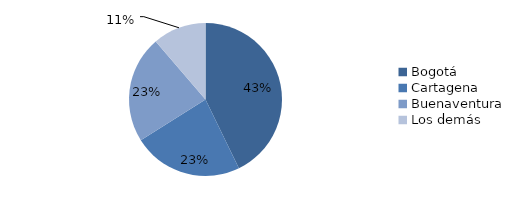
| Category | Series 0 |
|---|---|
| Bogotá | 509.933 |
| Cartagena | 276.904 |
| Buenaventura | 270.109 |
| Los demás | 134.34 |